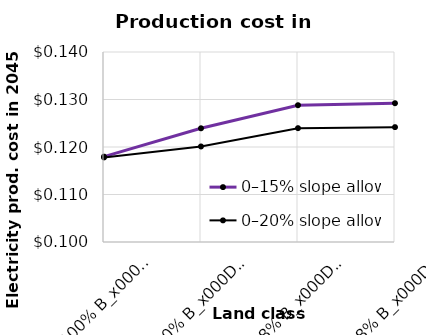
| Category | 0–15% slope allowed | 0–20% slope allowed |
|---|---|---|
| 100% B_x000d_100% C | 0.118 | 0.118 |
| 10% B_x000d_10% C | 0.124 | 0.12 |
| 1.8% B_x000d_1.1% C | 0.129 | 0.124 |
| 1.8% B_x000d_1.1% C_x000d_no new wind | 0.129 | 0.124 |